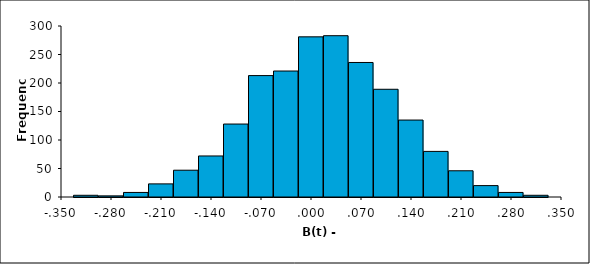
| Category | Series 0 |
|---|---|
| -0.35 | 0 |
| -0.315 | 3 |
| -0.28 | 2 |
| -0.245 | 8 |
| -0.21 | 23 |
| -0.175 | 47 |
| -0.14 | 72 |
| -0.105 | 128 |
| -0.0699999999999999 | 213 |
| -0.0349999999999999 | 221 |
| 1.11022302462516e-16 | 281 |
| 0.0350000000000001 | 283 |
| 0.0700000000000001 | 236 |
| 0.105 | 189 |
| 0.14 | 135 |
| 0.175 | 80 |
| 0.21 | 46 |
| 0.245 | 20 |
| 0.28 | 8 |
| 0.315 | 3 |
| 0.35 | 0 |